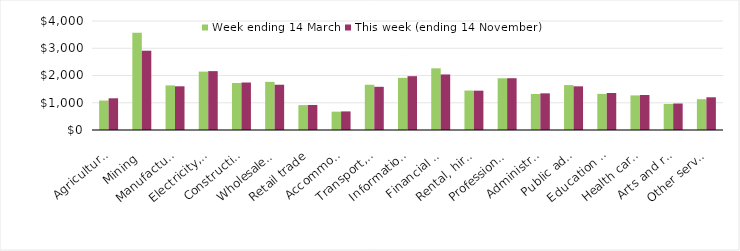
| Category | Week ending 14 March | This week (ending 14 November) |
|---|---|---|
| Agriculture, forestry and fishing | 1081.09 | 1163.62 |
| Mining | 3566.49 | 2909.4 |
| Manufacturing | 1636.94 | 1603.57 |
| Electricity, gas, water and waste services | 2142.79 | 2160.8 |
| Construction | 1724.39 | 1742.63 |
| Wholesale trade | 1766.43 | 1660.78 |
| Retail trade | 913.07 | 918.6 |
| Accommodation and food services | 672.9 | 682.29 |
| Transport, postal and warehousing | 1660.37 | 1585.21 |
| Information media and telecommunications | 1914.07 | 1974.86 |
| Financial and insurance services | 2263.6 | 2038.37 |
| Rental, hiring and real estate services | 1447.32 | 1443.47 |
| Professional, scientific and technical services | 1897.84 | 1900.34 |
| Administrative and support services | 1321.72 | 1345.45 |
| Public administration and safety | 1647.98 | 1602.79 |
| Education and training | 1325.27 | 1358.86 |
| Health care and social assistance | 1270.02 | 1283.97 |
| Arts and recreation services | 958.25 | 972.29 |
| Other services | 1130.57 | 1200.64 |